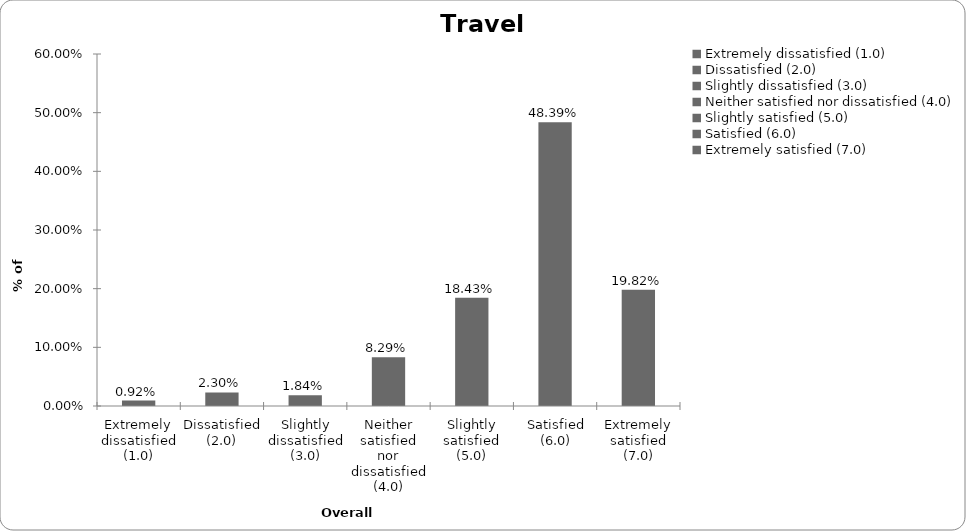
| Category | Series 0 |
|---|---|
| Extremely dissatisfied (1.0) | 0.009 |
| Dissatisfied (2.0) | 0.023 |
| Slightly dissatisfied (3.0) | 0.018 |
| Neither satisfied nor dissatisfied (4.0) | 0.083 |
| Slightly satisfied (5.0) | 0.184 |
| Satisfied (6.0) | 0.484 |
| Extremely satisfied (7.0) | 0.198 |